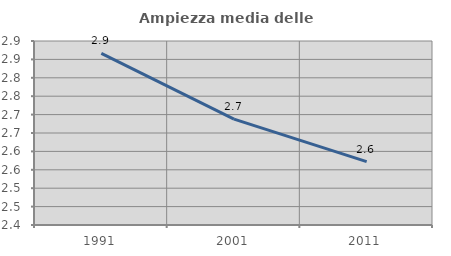
| Category | Ampiezza media delle famiglie |
|---|---|
| 1991.0 | 2.866 |
| 2001.0 | 2.688 |
| 2011.0 | 2.572 |